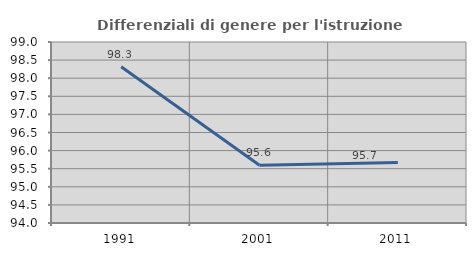
| Category | Differenziali di genere per l'istruzione superiore |
|---|---|
| 1991.0 | 98.317 |
| 2001.0 | 95.596 |
| 2011.0 | 95.672 |